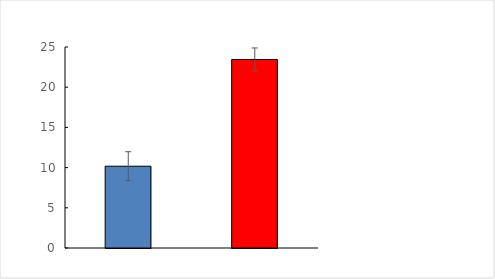
| Category | Series 0 |
|---|---|
| Veh | 10.17 |
| DT | 23.449 |